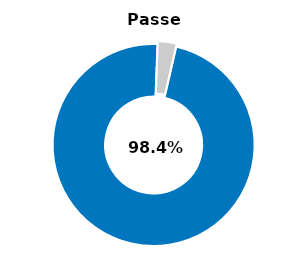
| Category | Series 0 |
|---|---|
| Passed | 0.97 |
| Other | 0.03 |